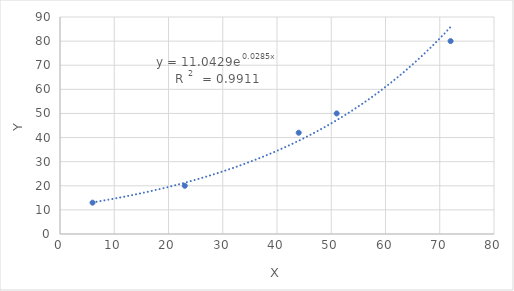
| Category | Series 0 |
|---|---|
| 6.0 | 13 |
| 23.0 | 20 |
| 44.0 | 42 |
| 51.0 | 50 |
| 72.0 | 80 |